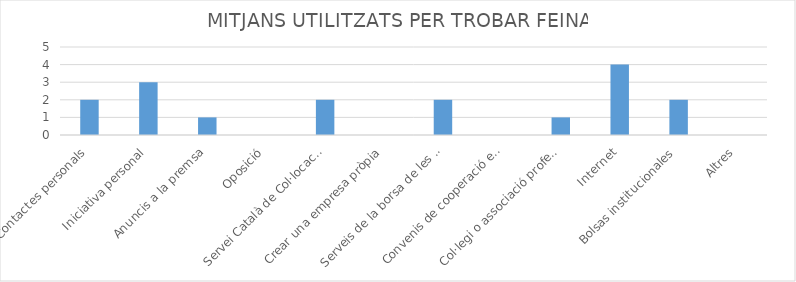
| Category | Series 0 |
|---|---|
| Contactes personals | 2 |
| Iniciativa personal | 3 |
| Anuncis a la premsa | 1 |
| Oposició | 0 |
| Servei Català de Col·locació | 2 |
| Crear una empresa pròpia | 0 |
| Serveis de la borsa de les universitats | 2 |
| Convenis de cooperació educativa | 0 |
| Col·legi o associació professional | 1 |
| Internet | 4 |
| Bolsas institucionales | 2 |
| Altres | 0 |